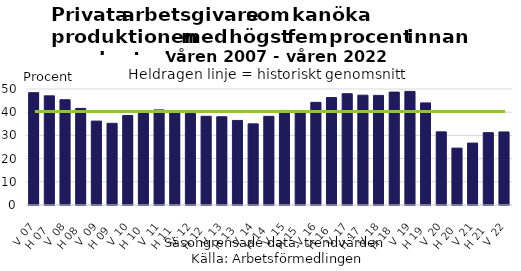
| Category | 0-5 procent |
|---|---|
| V 07 | 48.43 |
| H 07 | 47.04 |
| V 08 | 45.37 |
| H 08 | 41.63 |
| V 09 | 36.17 |
| H 09 | 35.21 |
| V 10 | 38.54 |
| H 10 | 40.7 |
| V 11 | 41 |
| H 11 | 40.55 |
| V 12 | 39.47 |
| H 12 | 38.24 |
| V 13 | 38.04 |
| H 13 | 36.45 |
| V 14 | 34.98 |
| H 14 | 38.22 |
| V 15 | 40.76 |
| H 15 | 40.72 |
| V 16 | 44.24 |
| H 16 | 46.3 |
| V 17 | 47.97 |
| H 17 | 47.34 |
| V 18 | 47.25 |
| H 18 | 48.66 |
| V 19 | 48.97 |
| H 19 | 44.01 |
| V 20 | 31.52 |
| H 20 | 24.52 |
| V 21 | 26.69 |
| H 21 | 31.18 |
| V 22 | 31.49 |